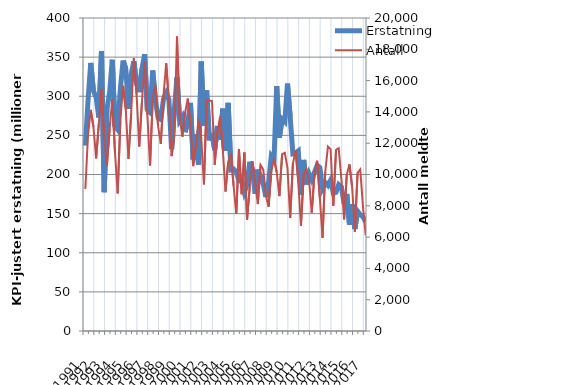
| Category | Erstatning |
|---|---|
| 1991.0 | 236.93 |
| nan | 294.783 |
| nan | 342.604 |
| nan | 306.85 |
| 1992.0 | 298.702 |
| nan | 272.93 |
| nan | 357.674 |
| nan | 177.392 |
| 1993.0 | 282.989 |
| nan | 304.909 |
| nan | 346.657 |
| nan | 261.754 |
| 1994.0 | 257.298 |
| nan | 309.812 |
| nan | 345.57 |
| nan | 335.26 |
| 1995.0 | 283.864 |
| nan | 328.377 |
| nan | 344.843 |
| nan | 315.774 |
| 1996.0 | 305.279 |
| nan | 335.126 |
| nan | 353.585 |
| nan | 282.683 |
| 1997.0 | 279.48 |
| nan | 332.877 |
| nan | 294.639 |
| nan | 272.383 |
| 1998.0 | 270.352 |
| nan | 296.571 |
| nan | 304.109 |
| nan | 295.927 |
| 1999.0 | 232.48 |
| nan | 282.091 |
| nan | 324.198 |
| nan | 268.894 |
| 2000.0 | 274.096 |
| nan | 254.192 |
| nan | 266.636 |
| nan | 291.498 |
| 2001.0 | 219.204 |
| nan | 251.418 |
| nan | 212.311 |
| nan | 344.35 |
| 2002.0 | 262.177 |
| nan | 307.371 |
| nan | 243.755 |
| nan | 253.074 |
| 2003.0 | 231.225 |
| nan | 262.007 |
| nan | 244.31 |
| nan | 284.07 |
| 2004.0 | 230.06 |
| nan | 291.643 |
| nan | 206.052 |
| nan | 206.912 |
| 2005.0 | 203.382 |
| nan | 191.684 |
| nan | 192.48 |
| nan | 177.255 |
| 2006.0 | 187.023 |
| nan | 216.279 |
| nan | 206.275 |
| nan | 175.342 |
| 2007.0 | 206.294 |
| nan | 197.065 |
| nan | 187.945 |
| nan | 171.171 |
| 2008.0 | 190.176 |
| nan | 223.609 |
| nan | 219.141 |
| nan | 313.056 |
| 2009.0 | 246.971 |
| nan | 271.054 |
| nan | 267.661 |
| nan | 316.135 |
| 2010.0 | 273.511 |
| nan | 226.468 |
| nan | 227.397 |
| nan | 230.109 |
| 2011.0 | 174.049 |
| nan | 218.637 |
| nan | 187.211 |
| nan | 200.949 |
| 2012.0 | 193.218 |
| nan | 202.53 |
| nan | 211.663 |
| nan | 208.882 |
| 2013.0 | 182.74 |
| nan | 189.941 |
| nan | 186.037 |
| nan | 192.746 |
| 2014.0 | 176.109 |
| nan | 177.235 |
| nan | 187.111 |
| nan | 184.198 |
| 2015.0 | 162.554 |
| nan | 175.142 |
| nan | 135.952 |
| nan | 162.027 |
| 2016.0 | 130.485 |
| nan | 153.144 |
| nan | 148.639 |
| nan | 145.95 |
| 2017.0 | 139.586 |